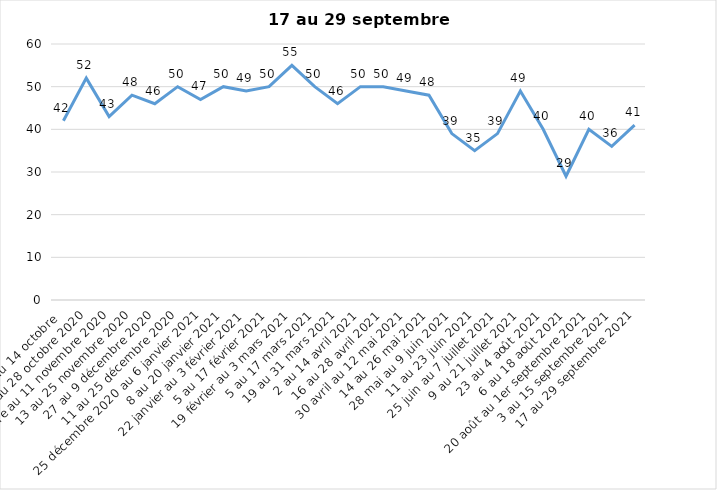
| Category | Toujours aux trois mesures |
|---|---|
| 2 au 14 octobre  | 42 |
| 16 au 28 octobre 2020 | 52 |
| 30 octobre au 11 novembre 2020 | 43 |
| 13 au 25 novembre 2020 | 48 |
| 27 au 9 décembre 2020 | 46 |
| 11 au 25 décembre 2020 | 50 |
| 25 décembre 2020 au 6 janvier 2021 | 47 |
| 8 au 20 janvier 2021 | 50 |
| 22 janvier au 3 février 2021 | 49 |
| 5 au 17 février 2021 | 50 |
| 19 février au 3 mars 2021 | 55 |
| 5 au 17 mars 2021 | 50 |
| 19 au 31 mars 2021 | 46 |
| 2 au 14 avril 2021 | 50 |
| 16 au 28 avril 2021 | 50 |
| 30 avril au 12 mai 2021 | 49 |
| 14 au 26 mai 2021 | 48 |
| 28 mai au 9 juin 2021 | 39 |
| 11 au 23 juin 2021 | 35 |
| 25 juin au 7 juillet 2021 | 39 |
| 9 au 21 juillet 2021 | 49 |
| 23 au 4 août 2021 | 40 |
| 6 au 18 août 2021 | 29 |
| 20 août au 1er septembre 2021 | 40 |
| 3 au 15 septembre 2021 | 36 |
| 17 au 29 septembre 2021 | 41 |